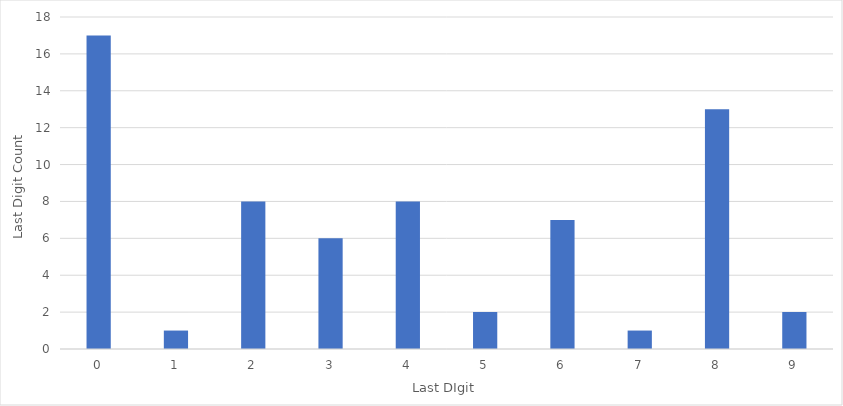
| Category | Series 0 |
|---|---|
| 0.0 | 17 |
| 1.0 | 1 |
| 2.0 | 8 |
| 3.0 | 6 |
| 4.0 | 8 |
| 5.0 | 2 |
| 6.0 | 7 |
| 7.0 | 1 |
| 8.0 | 13 |
| 9.0 | 2 |